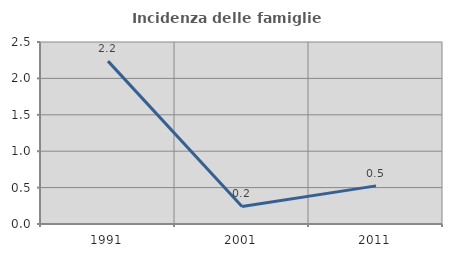
| Category | Incidenza delle famiglie numerose |
|---|---|
| 1991.0 | 2.237 |
| 2001.0 | 0.242 |
| 2011.0 | 0.524 |